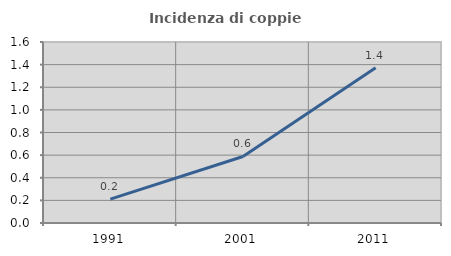
| Category | Incidenza di coppie miste |
|---|---|
| 1991.0 | 0.211 |
| 2001.0 | 0.588 |
| 2011.0 | 1.373 |